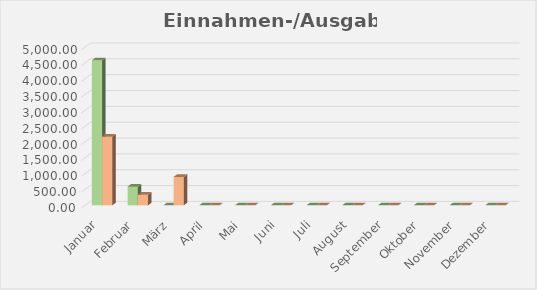
| Category | Series 0 | Series 1 |
|---|---|---|
| Januar | 4576.89 | 2165.5 |
| Februar | 590 | 336 |
| März | 0 | 896.66 |
| April | 0 | 0 |
| Mai | 0 | 0 |
| Juni | 0 | 0 |
| Juli | 0 | 0 |
| August | 0 | 0 |
| September | 0 | 0 |
| Oktober | 0 | 0 |
| November | 0 | 0 |
| Dezember | 0 | 0 |